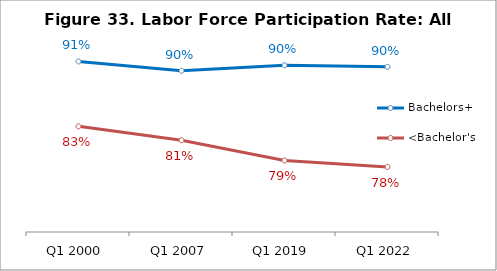
| Category | Bachelors+ | <Bachelor's |
|---|---|---|
| Q1 2000 | 0.908 | 0.829 |
| Q1 2007 | 0.897 | 0.812 |
| Q1 2019 | 0.903 | 0.787 |
| Q1 2022 | 0.901 | 0.779 |